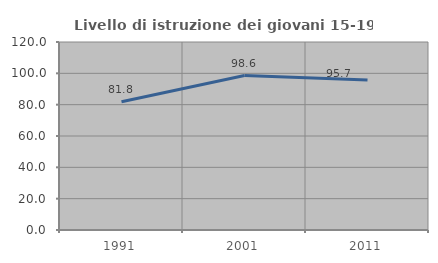
| Category | Livello di istruzione dei giovani 15-19 anni |
|---|---|
| 1991.0 | 81.818 |
| 2001.0 | 98.611 |
| 2011.0 | 95.745 |